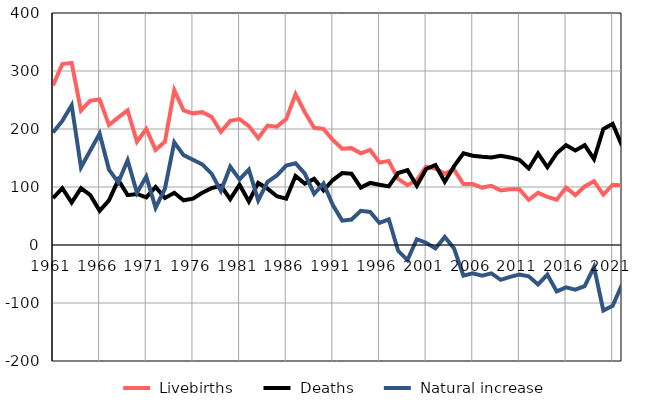
| Category |  Livebirths |  Deaths |  Natural increase |
|---|---|---|---|
| 1961.0 | 275 | 81 | 194 |
| 1962.0 | 312 | 98 | 214 |
| 1963.0 | 314 | 73 | 241 |
| 1964.0 | 232 | 98 | 134 |
| 1965.0 | 249 | 86 | 163 |
| 1966.0 | 251 | 59 | 192 |
| 1967.0 | 207 | 77 | 130 |
| 1968.0 | 220 | 112 | 108 |
| 1969.0 | 232 | 86 | 146 |
| 1970.0 | 178 | 88 | 90 |
| 1971.0 | 200 | 82 | 118 |
| 1972.0 | 164 | 100 | 64 |
| 1973.0 | 178 | 81 | 97 |
| 1974.0 | 267 | 90 | 177 |
| 1975.0 | 232 | 77 | 155 |
| 1976.0 | 227 | 80 | 147 |
| 1977.0 | 229 | 90 | 139 |
| 1978.0 | 221 | 98 | 123 |
| 1979.0 | 195 | 102 | 93 |
| 1980.0 | 214 | 79 | 135 |
| 1981.0 | 217 | 104 | 113 |
| 1982.0 | 205 | 75 | 130 |
| 1983.0 | 184 | 107 | 77 |
| 1984.0 | 206 | 97 | 109 |
| 1985.0 | 204 | 84 | 120 |
| 1986.0 | 217 | 80 | 137 |
| 1987.0 | 260 | 119 | 141 |
| 1988.0 | 229 | 106 | 123 |
| 1989.0 | 202 | 114 | 88 |
| 1990.0 | 200 | 94 | 106 |
| 1991.0 | 181 | 112 | 69 |
| 1992.0 | 166 | 124 | 42 |
| 1993.0 | 167 | 123 | 44 |
| 1994.0 | 158 | 99 | 59 |
| 1995.0 | 164 | 107 | 57 |
| 1996.0 | 142 | 104 | 38 |
| 1997.0 | 145 | 101 | 44 |
| 1998.0 | 114 | 124 | -10 |
| 1999.0 | 103 | 129 | -26 |
| 2000.0 | 112 | 102 | 10 |
| 2001.0 | 135 | 131 | 4 |
| 2002.0 | 132 | 138 | -6 |
| 2003.0 | 123 | 109 | 14 |
| 2004.0 | 130 | 136 | -6 |
| 2005.0 | 105 | 158 | -53 |
| 2006.0 | 105 | 154 | -49 |
| 2007.0 | 99 | 152 | -53 |
| 2008.0 | 102 | 151 | -49 |
| 2009.0 | 94 | 154 | -60 |
| 2010.0 | 96 | 151 | -55 |
| 2011.0 | 96 | 147 | -51 |
| 2012.0 | 78 | 132 | -54 |
| 2013.0 | 90 | 158 | -68 |
| 2014.0 | 83 | 134 | -51 |
| 2015.0 | 78 | 158 | -80 |
| 2016.0 | 99 | 172 | -73 |
| 2017.0 | 86 | 163 | -77 |
| 2018.0 | 101 | 172 | -71 |
| 2019.0 | 110 | 148 | -38 |
| 2020.0 | 87 | 200 | -113 |
| 2021.0 | 104 | 209 | -105 |
| 2022.0 | 103 | 171 | -68 |